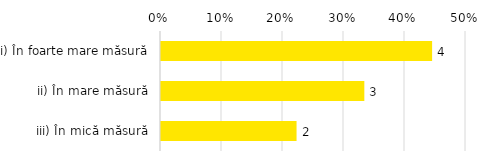
| Category | Total |
|---|---|
| i) În foarte mare măsură | 0.444 |
| ii) În mare măsură | 0.333 |
| iii) În mică măsură | 0.222 |